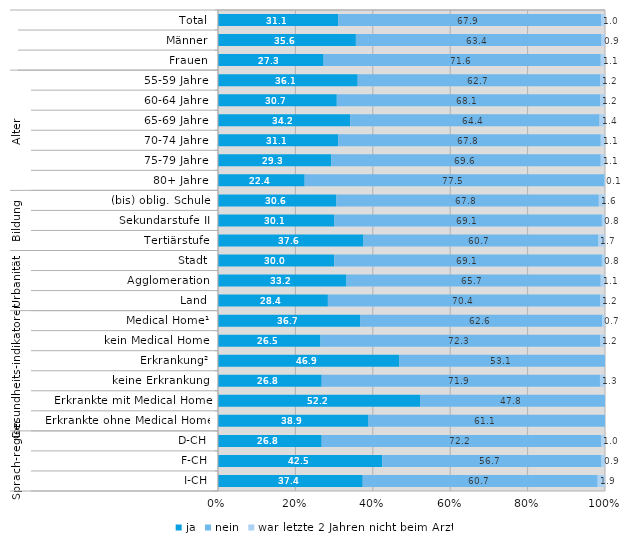
| Category | ja | nein | war letzte 2 Jahren nicht beim Arzt |
|---|---|---|---|
| 0 | 31.1 | 67.9 | 1 |
| 1 | 35.6 | 63.4 | 0.9 |
| 2 | 27.3 | 71.6 | 1.1 |
| 3 | 36.1 | 62.7 | 1.2 |
| 4 | 30.7 | 68.1 | 1.2 |
| 5 | 34.2 | 64.4 | 1.4 |
| 6 | 31.1 | 67.8 | 1.1 |
| 7 | 29.3 | 69.6 | 1.1 |
| 8 | 22.4 | 77.5 | 0.1 |
| 9 | 30.6 | 67.8 | 1.6 |
| 10 | 30.1 | 69.1 | 0.8 |
| 11 | 37.6 | 60.7 | 1.7 |
| 12 | 30 | 69.1 | 0.8 |
| 13 | 33.2 | 65.7 | 1.1 |
| 14 | 28.4 | 70.4 | 1.2 |
| 15 | 36.7 | 62.6 | 0.7 |
| 16 | 26.5 | 72.3 | 1.2 |
| 17 | 46.9 | 53.1 | 0 |
| 18 | 26.8 | 71.9 | 1.3 |
| 19 | 52.2 | 47.8 | 0 |
| 20 | 38.9 | 61.1 | 0 |
| 21 | 26.8 | 72.2 | 1 |
| 22 | 42.5 | 56.7 | 0.9 |
| 23 | 37.4 | 60.7 | 1.9 |